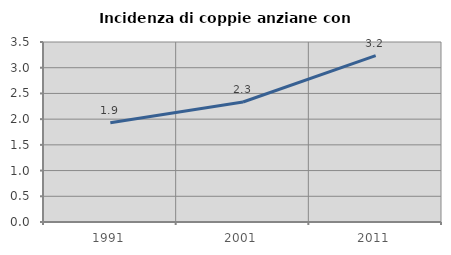
| Category | Incidenza di coppie anziane con figli |
|---|---|
| 1991.0 | 1.929 |
| 2001.0 | 2.333 |
| 2011.0 | 3.235 |